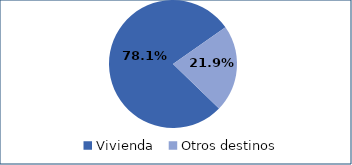
| Category | Series 0 |
|---|---|
| Vivienda | 0.781 |
| Otros destinos | 0.219 |